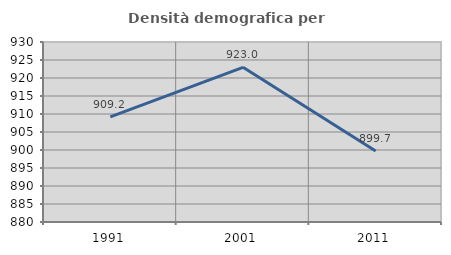
| Category | Densità demografica |
|---|---|
| 1991.0 | 909.186 |
| 2001.0 | 922.973 |
| 2011.0 | 899.745 |